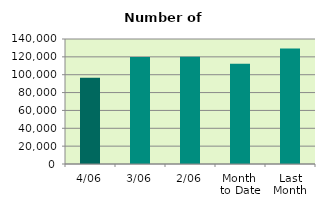
| Category | Series 0 |
|---|---|
| 4/06 | 96540 |
| 3/06 | 119948 |
| 2/06 | 120110 |
| Month 
to Date | 112230 |
| Last
Month | 129378.19 |